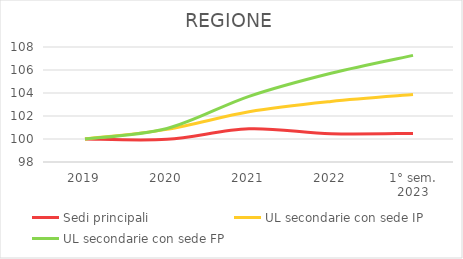
| Category | Sedi principali | UL secondarie con sede IP | UL secondarie con sede FP |
|---|---|---|---|
| 2019 | 100 | 100 | 100 |
| 2020 | 99.968 | 100.837 | 100.917 |
| 2021 | 100.885 | 102.368 | 103.711 |
| 2022 | 100.456 | 103.263 | 105.721 |
| 1° sem.
2023 | 100.487 | 103.86 | 107.27 |